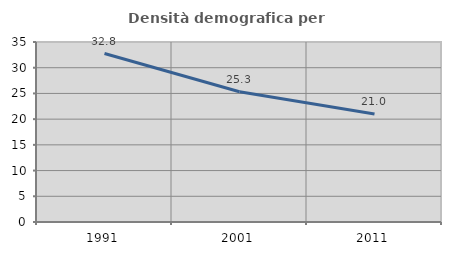
| Category | Densità demografica |
|---|---|
| 1991.0 | 32.757 |
| 2001.0 | 25.32 |
| 2011.0 | 20.982 |